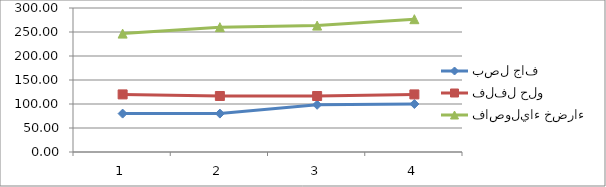
| Category | بصل جاف | فلفل حلو | فاصولياء خضراء |
|---|---|---|---|
| 0 | 80 | 120 | 246.67 |
| 1 | 80 | 116.67 | 260 |
| 2 | 98.33 | 116.67 | 263.33 |
| 3 | 100 | 120 | 276.67 |